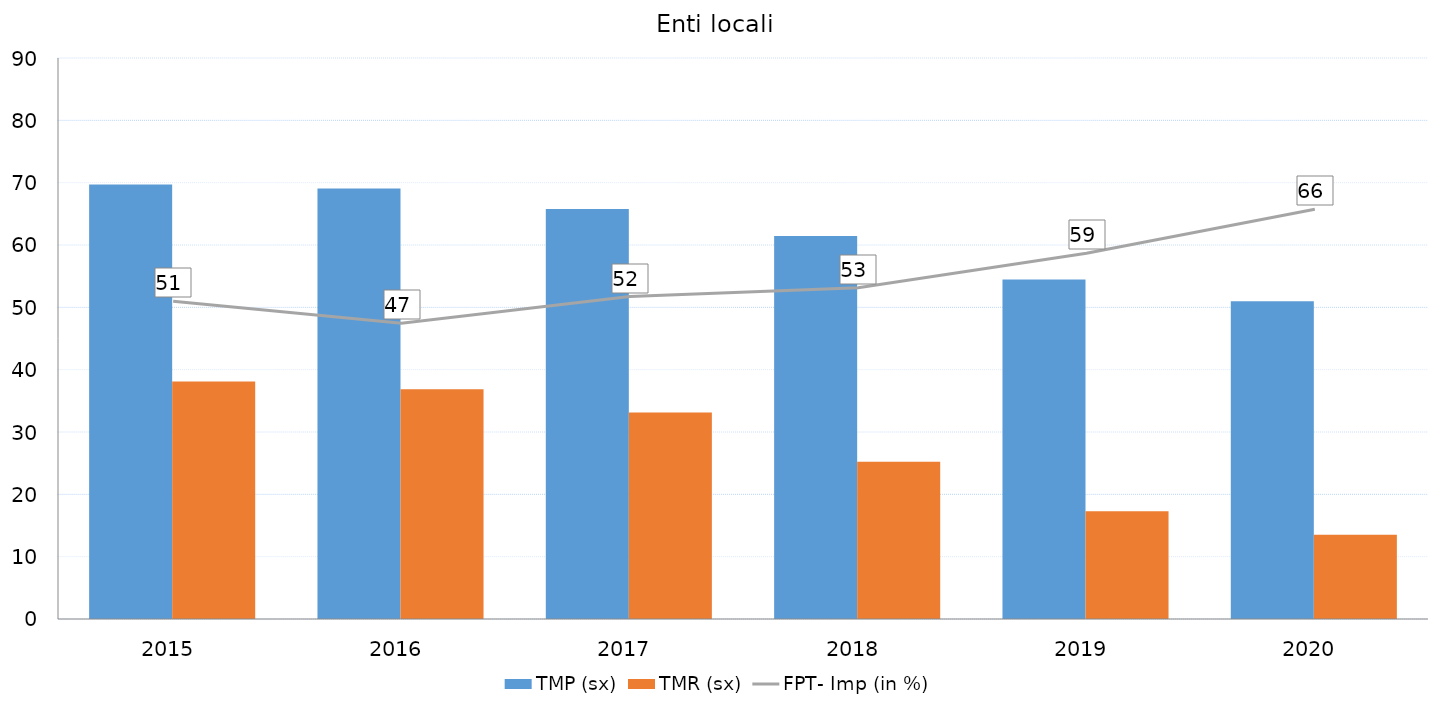
| Category | TMP (sx) | TMR (sx) |
|---|---|---|
| 2015.0 | 69.72 | 38.117 |
| 2016.0 | 69.083 | 36.847 |
| 2017.0 | 65.762 | 33.112 |
| 2018.0 | 61.449 | 25.244 |
| 2019.0 | 54.468 | 17.277 |
| 2020.0 | 50.984 | 13.531 |